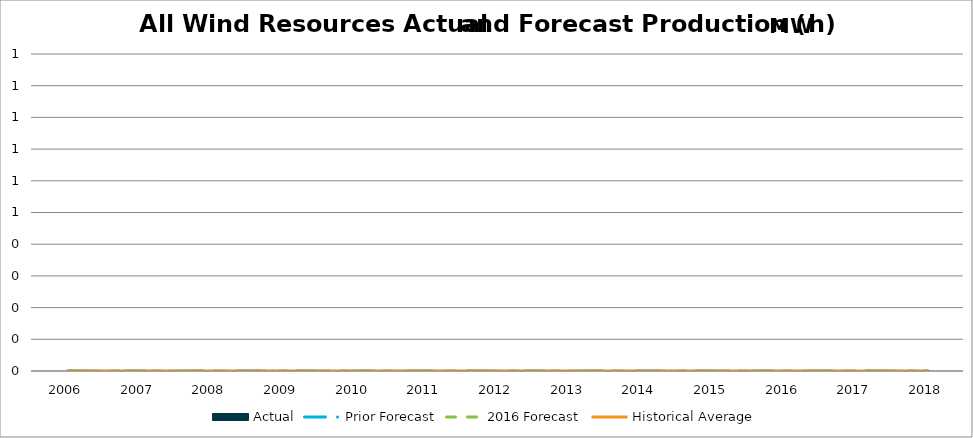
| Category | Actual |
|---|---|
| 0 | 0 |
| 1 | 0 |
| 2 | 0 |
| 3 | 0 |
| 4 | 0 |
| 5 | 0 |
| 6 | 0 |
| 7 | 0 |
| 8 | 0 |
| 9 | 0 |
| 10 | 0 |
| 11 | 0 |
| 12 | 0 |